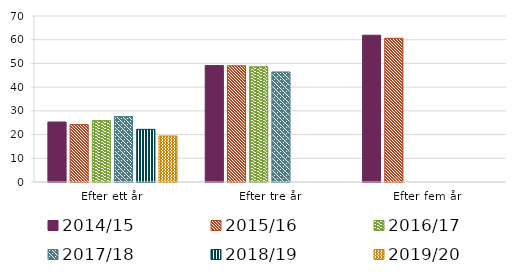
| Category | 2014/15 | 2015/16 | 2016/17 | 2017/18 | 2018/19 | 2019/20 |
|---|---|---|---|---|---|---|
| Efter ett år | 25.3 | 24.2 | 25.9 | 27.6 | 22.2 | 19.4 |
| Efter tre år | 49.1 | 49 | 48.6 | 46.4 | 0 | 0 |
| Efter fem år | 61.9 | 60.6 | 0 | 0 | 0 | 0 |